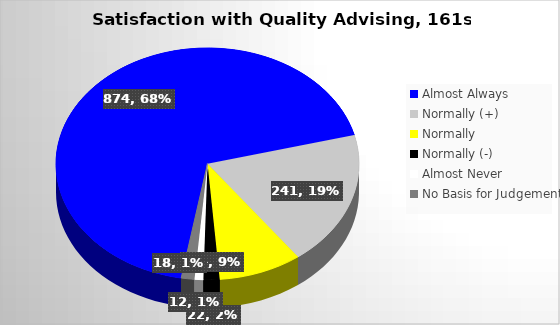
| Category | Series 0 |
|---|---|
| Almost Always | 874 |
| Normally (+) | 241 |
| Normally  | 114 |
| Normally (-) | 22 |
| Almost Never | 12 |
| No Basis for Judgement | 18 |